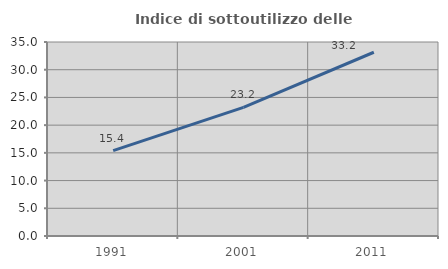
| Category | Indice di sottoutilizzo delle abitazioni  |
|---|---|
| 1991.0 | 15.412 |
| 2001.0 | 23.212 |
| 2011.0 | 33.15 |